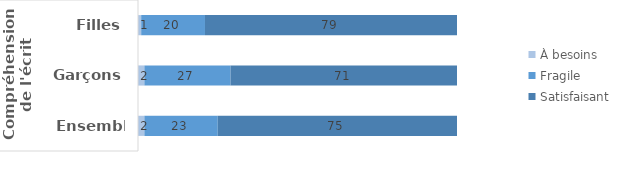
| Category | À besoins | Fragile | Satisfaisant |
|---|---|---|---|
| 0 | 2 | 23 | 75 |
| 1 | 2 | 27 | 71 |
| 2 | 1 | 20 | 79 |